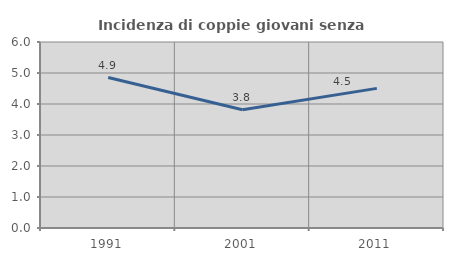
| Category | Incidenza di coppie giovani senza figli |
|---|---|
| 1991.0 | 4.852 |
| 2001.0 | 3.816 |
| 2011.0 | 4.504 |